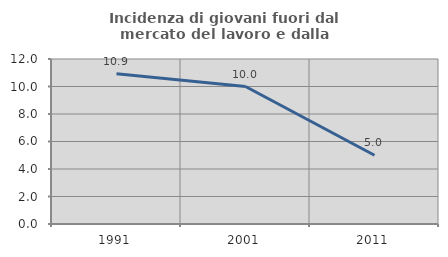
| Category | Incidenza di giovani fuori dal mercato del lavoro e dalla formazione  |
|---|---|
| 1991.0 | 10.924 |
| 2001.0 | 10 |
| 2011.0 | 5 |